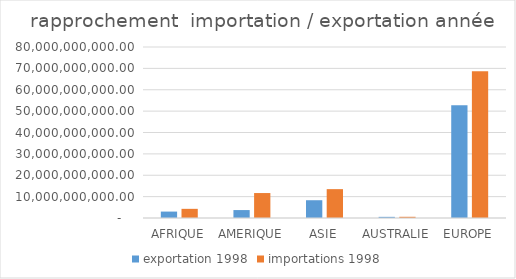
| Category | exportation 1998 | importations 1998 |
|---|---|---|
| AFRIQUE | 3004623845 | 4284616178 |
| AMERIQUE | 3712986641 | 11674027734 |
| ASIE | 8318251871 | 13503052283 |
| AUSTRALIE | 534109458 | 564536364 |
| EUROPE | 52724599564 | 68648823533 |